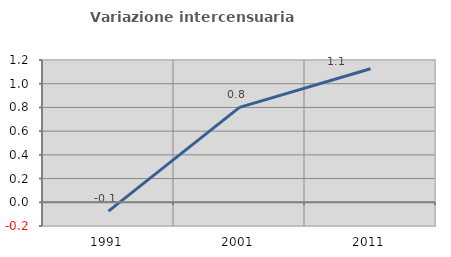
| Category | Variazione intercensuaria annua |
|---|---|
| 1991.0 | -0.075 |
| 2001.0 | 0.801 |
| 2011.0 | 1.126 |